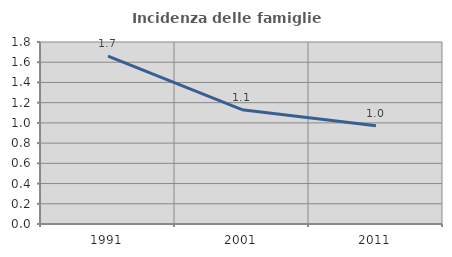
| Category | Incidenza delle famiglie numerose |
|---|---|
| 1991.0 | 1.661 |
| 2001.0 | 1.131 |
| 2011.0 | 0.971 |